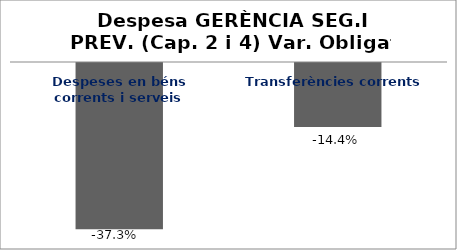
| Category | Series 0 |
|---|---|
| Despeses en béns corrents i serveis | -0.373 |
| Transferències corrents | -0.144 |